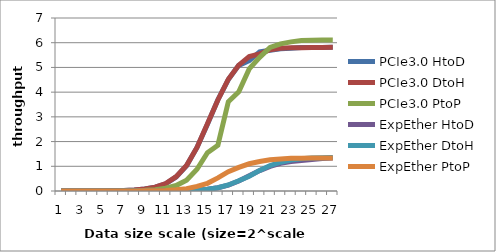
| Category | PCIe3.0 HtoD | PCIe3.0 DtoH | PCIe3.0 PtoP | ExpEther HtoD | ExpEther DtoH | ExpEther PtoP |
|---|---|---|---|---|---|---|
| 0 | 0 | 0 | 0 | 0 | 0 | 0 |
| 1 | 0.001 | 0.001 | 0 | 0 | 0 | 0 |
| 2 | 0.001 | 0.001 | 0 | 0 | 0 | 0 |
| 3 | 0.002 | 0.002 | 0.001 | 0 | 0 | 0 |
| 4 | 0.005 | 0.005 | 0.002 | 0 | 0 | 0 |
| 5 | 0.01 | 0.01 | 0.003 | 0 | 0 | 0.001 |
| 6 | 0.019 | 0.02 | 0.007 | 0 | 0 | 0.002 |
| 7 | 0.039 | 0.039 | 0.014 | 0.001 | 0.001 | 0.003 |
| 8 | 0.077 | 0.079 | 0.028 | 0.001 | 0.001 | 0.007 |
| 9 | 0.153 | 0.154 | 0.056 | 0.002 | 0.002 | 0.012 |
| 10 | 0.293 | 0.304 | 0.111 | 0.005 | 0.005 | 0.024 |
| 11 | 0.568 | 0.578 | 0.221 | 0.009 | 0.009 | 0.047 |
| 12 | 1.021 | 1.029 | 0.439 | 0.018 | 0.018 | 0.094 |
| 13 | 1.762 | 1.761 | 0.878 | 0.036 | 0.036 | 0.185 |
| 14 | 2.702 | 2.725 | 1.551 | 0.07 | 0.07 | 0.311 |
| 15 | 3.694 | 3.682 | 1.855 | 0.133 | 0.133 | 0.53 |
| 16 | 4.512 | 4.523 | 3.612 | 0.24 | 0.245 | 0.781 |
| 17 | 5.084 | 5.093 | 4.013 | 0.405 | 0.416 | 0.957 |
| 18 | 5.274 | 5.437 | 4.939 | 0.614 | 0.599 | 1.101 |
| 19 | 5.634 | 5.548 | 5.408 | 0.827 | 0.835 | 1.192 |
| 20 | 5.698 | 5.719 | 5.808 | 0.999 | 1.028 | 1.263 |
| 21 | 5.759 | 5.773 | 5.955 | 1.121 | 1.165 | 1.295 |
| 22 | 5.773 | 5.801 | 6.034 | 1.192 | 1.252 | 1.327 |
| 23 | 5.81 | 5.794 | 6.088 | 1.234 | 1.303 | 1.325 |
| 24 | 5.806 | 5.802 | 6.101 | 1.271 | 1.332 | 1.332 |
| 25 | 5.811 | 5.808 | 6.114 | 1.311 | 1.342 | 1.332 |
| 26 | 5.814 | 5.816 | 6.108 | 1.334 | 1.353 | 1.334 |